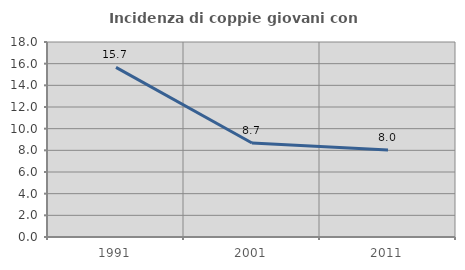
| Category | Incidenza di coppie giovani con figli |
|---|---|
| 1991.0 | 15.655 |
| 2001.0 | 8.682 |
| 2011.0 | 8.028 |